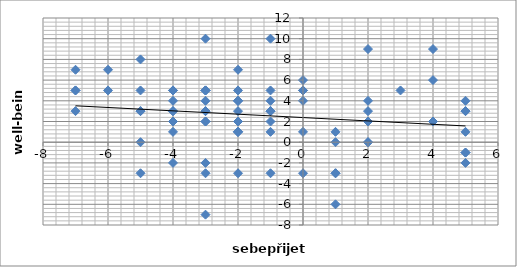
| Category | sum_p6-10 |
|---|---|
| -1.0 | 5 |
| 2.0 | 4 |
| 2.0 | 4 |
| 2.0 | 5 |
| -2.0 | 0 |
| 1.0 | 6 |
| 1.0 | 3 |
| 5.0 | 4 |
| -6.0 | -2 |
| -5.0 | 3 |
| -5.0 | -3 |
| -5.0 | 3 |
| 2.0 | -6 |
| 2.0 | 10 |
| -3.0 | 5 |
| -1.0 | 1 |
| 2.0 | 5 |
| -1.0 | 5 |
| 1.0 | 4 |
| -1.0 | 3 |
| -2.0 | 0 |
| -1.0 | 2 |
| 0.0 | 4 |
| -3.0 | 5 |
| 1.0 | 4 |
| 1.0 | 9 |
| -1.0 | 1 |
| 1.0 | 5 |
| -3.0 | 1 |
| 4.0 | 1 |
| 5.0 | 7 |
| 1.0 | -1 |
| -4.0 | 3 |
| 5.0 | 4 |
| -5.0 | -3 |
| -9.0 | -3 |
| 2.0 | 3 |
| 1.0 | 4 |
| -1.0 | 5 |
| 1.0 | 3 |
| -9.0 | -7 |
| 4.0 | 1 |
| -9.0 | 2 |
| -1.0 | 5 |
| 4.0 | 8 |
| 0.0 | 3 |
| -1.0 | 2 |
| -1.0 | 3 |
| -5.0 | -3 |
| 3.0 | 0 |
| -4.0 | 3 |
| -1.0 | -2 |
| 2.0 | 5 |
| 6.0 | 5 |
| -4.0 | 1 |
| -1.0 | 3 |
| 2.0 | 2 |
| -8.0 | 5 |
| 0.0 | 3 |
| 2.0 | -2 |
| -1.0 | 5 |
| 5.0 | 7 |
| -3.0 | -3 |
| 1.0 | 0 |
| 8.0 | 6 |
| -5.0 | 2 |
| -2.0 | -3 |
| -2.0 | 10 |
| 1.0 | 5 |
| 4.0 | 7 |
| -3.0 | 1 |
| -2.0 | 3 |
| 4.0 | 9 |
| -1.0 | 4 |
| -1.0 | 2 |
| 0.0 | -1 |
| -1.0 | -3 |
| -2.0 | 2 |
| -5.0 | 1 |
| -2.0 | 3 |